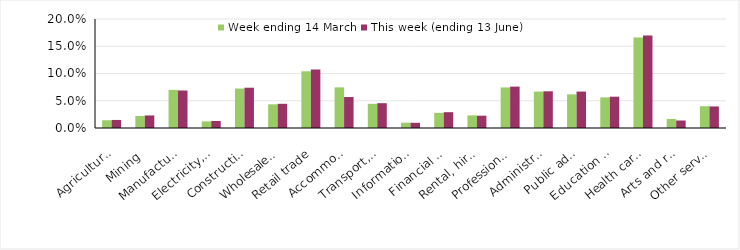
| Category | Week ending 14 March | This week (ending 13 June) |
|---|---|---|
| Agriculture, forestry and fishing | 0.014 | 0.015 |
| Mining | 0.022 | 0.023 |
| Manufacturing | 0.07 | 0.069 |
| Electricity, gas, water and waste services | 0.012 | 0.013 |
| Construction | 0.072 | 0.074 |
| Wholesale trade | 0.043 | 0.044 |
| Retail trade | 0.104 | 0.107 |
| Accommodation and food services | 0.075 | 0.057 |
| Transport, postal and warehousing | 0.044 | 0.046 |
| Information media and telecommunications | 0.01 | 0.01 |
| Financial and insurance services | 0.028 | 0.029 |
| Rental, hiring and real estate services | 0.023 | 0.023 |
| Professional, scientific and technical services | 0.074 | 0.076 |
| Administrative and support services | 0.067 | 0.067 |
| Public administration and safety | 0.062 | 0.067 |
| Education and training | 0.056 | 0.057 |
| Health care and social assistance | 0.166 | 0.17 |
| Arts and recreation services | 0.017 | 0.014 |
| Other services | 0.04 | 0.04 |